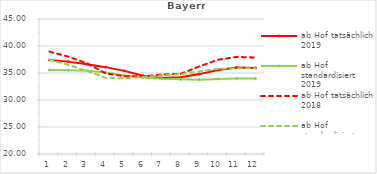
| Category | ab Hof tatsächlich 2019 | ab Hof standardisiert 2019 | ab Hof tatsächlich 2018 | ab Hof standardisiert 2018 |
|---|---|---|---|---|
| 0 | 37.427 | 35.562 | 38.971 | 37.484 |
| 1 | 37.107 | 35.494 | 38.035 | 36.505 |
| 2 | 36.63 | 35.416 | 36.8 | 35.371 |
| 3 | 36.085 | 35.093 | 34.928 | 34.132 |
| 4 | 35.398 | 34.557 | 34.404 | 34.016 |
| 5 | 34.509 | 34.178 | 34.376 | 34.267 |
| 6 | 34.082 | 33.923 | 34.711 | 34.557 |
| 7 | 34.209 | 33.823 | 34.845 | 34.773 |
| 8 | 34.795 | 33.758 | 36.223 | 35.292 |
| 9 | 35.566 | 33.9 | 37.461 | 35.758 |
| 10 | 36.029 | 33.993 | 37.974 | 35.89 |
| 11 | 35.946 | 33.986 | 37.866 | 35.87 |